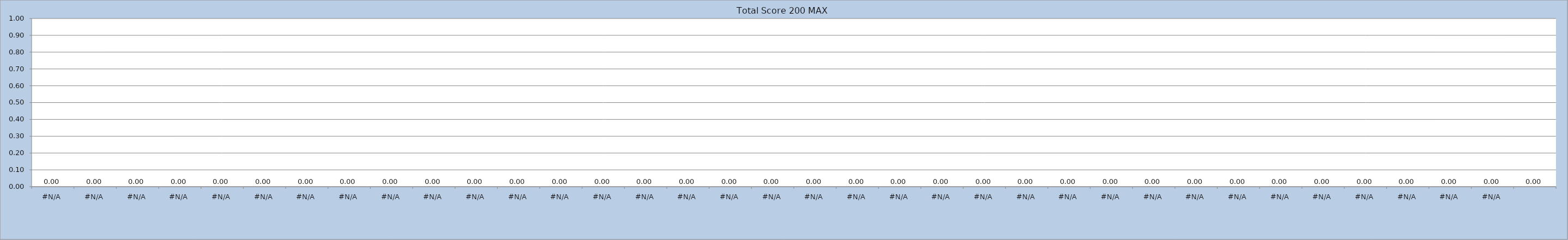
| Category | Total Score 200 MAX |
|---|---|
| #N/A | 0 |
| #N/A | 0 |
| #N/A | 0 |
| #N/A | 0 |
| #N/A | 0 |
| #N/A | 0 |
| #N/A | 0 |
| #N/A | 0 |
| #N/A | 0 |
| #N/A | 0 |
| #N/A | 0 |
| #N/A | 0 |
| #N/A | 0 |
| #N/A | 0 |
| #N/A | 0 |
| #N/A | 0 |
| #N/A | 0 |
| #N/A | 0 |
| #N/A | 0 |
| #N/A | 0 |
| #N/A | 0 |
| #N/A | 0 |
| #N/A | 0 |
| #N/A | 0 |
| #N/A | 0 |
| #N/A | 0 |
| #N/A | 0 |
| #N/A | 0 |
| #N/A | 0 |
| #N/A | 0 |
| #N/A | 0 |
| #N/A | 0 |
| #N/A | 0 |
| #N/A | 0 |
| #N/A | 0 |